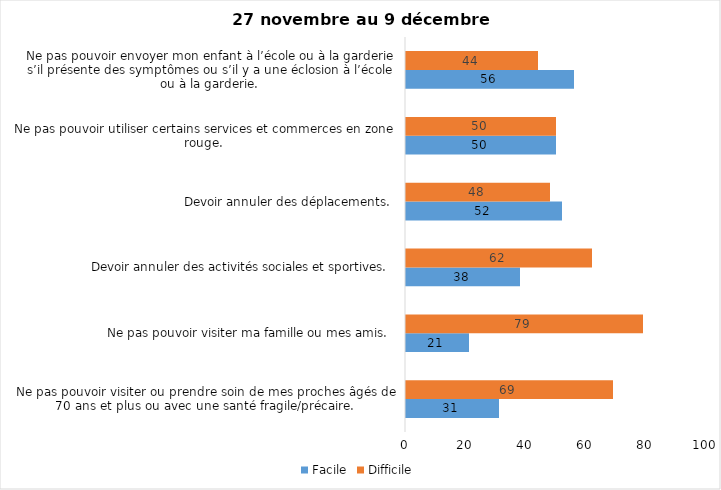
| Category | Facile | Difficile |
|---|---|---|
| Ne pas pouvoir visiter ou prendre soin de mes proches âgés de 70 ans et plus ou avec une santé fragile/précaire.  | 31 | 69 |
| Ne pas pouvoir visiter ma famille ou mes amis.  | 21 | 79 |
| Devoir annuler des activités sociales et sportives.  | 38 | 62 |
| Devoir annuler des déplacements.  | 52 | 48 |
| Ne pas pouvoir utiliser certains services et commerces en zone rouge.  | 50 | 50 |
| Ne pas pouvoir envoyer mon enfant à l’école ou à la garderie s’il présente des symptômes ou s’il y a une éclosion à l’école ou à la garderie.  | 56 | 44 |